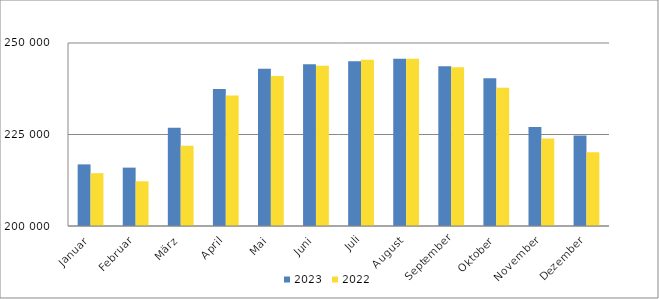
| Category | 2023 | 2022 |
|---|---|---|
| Januar | 216835 | 214429 |
| Februar | 215948 | 212210 |
| März | 226847 | 221960 |
| April | 237438 | 235651 |
| Mai | 242961 | 240984 |
| Juni | 244182 | 243781 |
| Juli | 245030 | 245413 |
| August | 245725 | 245717 |
| September | 243667 | 243363 |
| Oktober | 240340 | 237801 |
| November | 227035 | 223883 |
| Dezember | 224744 | 220165 |